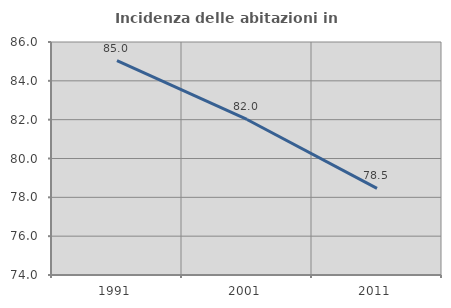
| Category | Incidenza delle abitazioni in proprietà  |
|---|---|
| 1991.0 | 85.042 |
| 2001.0 | 82.009 |
| 2011.0 | 78.462 |